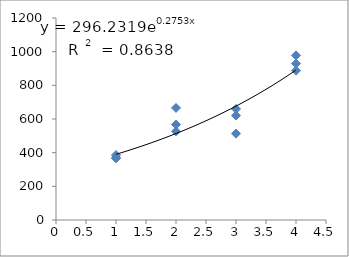
| Category | Series 0 |
|---|---|
| 1.0 | 366.606 |
| 1.0 | 370.097 |
| 1.0 | 385.809 |
| 2.0 | 665.727 |
| 2.0 | 526.729 |
| 2.0 | 566.965 |
| 3.0 | 620.289 |
| 3.0 | 513.148 |
| 3.0 | 659.762 |
| 4.0 | 929.109 |
| 4.0 | 977.826 |
| 4.0 | 887.351 |